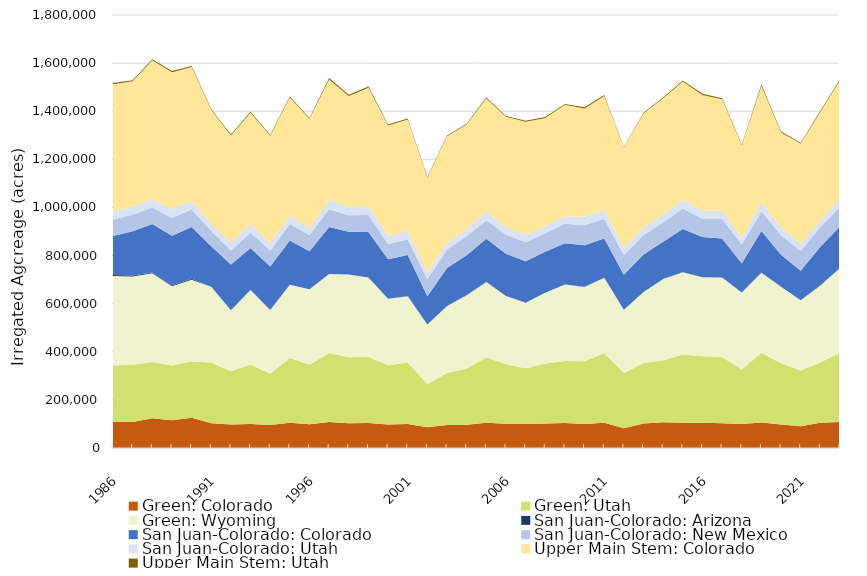
| Category | Green: Colorado | Green: Utah | Green: Wyoming | San Juan-Colorado: Arizona | San Juan-Colorado: Colorado | San Juan-Colorado: New Mexico | San Juan-Colorado: Utah | Upper Main Stem: Colorado | Upper Main Stem: Utah |
|---|---|---|---|---|---|---|---|---|---|
| 1986.0 | 108564.1 | 235099.1 | 371794.9 | 3542.6 | 161922.8 | 68577.935 | 33633.6 | 529498.6 | 4290.4 |
| 1987.0 | 107770.3 | 237896.3 | 367336.9 | 3640.4 | 183883.4 | 69008.867 | 34666.2 | 520237 | 4470.6 |
| 1988.0 | 123202.4 | 234502.7 | 368721.4 | 3605.4 | 200950.7 | 68965.9 | 33185.7 | 578417.6 | 4443.1 |
| 1989.0 | 115198.5 | 227786.3 | 329173.2 | 3615.4 | 206288.1 | 74526.852 | 35849.6 | 569736 | 4615.9 |
| 1990.0 | 125362.4 | 234484.6 | 339600.2 | 3615.4 | 215620.2 | 74213.884 | 33851.4 | 556662.9 | 4619.6 |
| 1991.0 | 102816.089 | 252582.027 | 315249.053 | 60.802 | 167611.681 | 63527.016 | 28973.363 | 475054.107 | 2971.505 |
| 1992.0 | 98001.317 | 220829.404 | 253893.974 | 960.042 | 189081.826 | 58082.038 | 30831.679 | 447688.819 | 3727.644 |
| 1993.0 | 99899.431 | 247557.215 | 309874.845 | 740.572 | 173714.392 | 63581.146 | 34891.268 | 462992.77 | 4849.187 |
| 1994.0 | 95855.856 | 212855.28 | 265392.669 | 443.58 | 179721.995 | 66030.718 | 30922.055 | 446907.934 | 3343.739 |
| 1995.0 | 104803.051 | 269739.684 | 303878.728 | 670.646 | 183443.244 | 68602.664 | 34271.201 | 491149.618 | 4615.3 |
| 1996.0 | 98979.612 | 247104.93 | 313726.681 | 255.992 | 158324.201 | 66661.802 | 27790.065 | 455653.498 | 3417.122 |
| 1997.0 | 108085.373 | 287114.978 | 327897.571 | 602.453 | 195298.019 | 73200.696 | 39514.212 | 500198.913 | 5697.496 |
| 1998.0 | 102461.942 | 274405.074 | 343958.893 | 396.016 | 177546.191 | 68719.799 | 34837.383 | 460998.235 | 4790.471 |
| 1999.0 | 103640.832 | 276206.8 | 328817.883 | 432.022 | 188415.858 | 70960.851 | 37371.301 | 491950.516 | 4919.034 |
| 2000.0 | 97617.477 | 246289.445 | 276050.322 | 263.601 | 163969.261 | 63750.331 | 31945.661 | 460793.985 | 4186.443 |
| 2001.0 | 100278.168 | 255191.714 | 275622.704 | 368.231 | 170340.513 | 66449.017 | 34476.178 | 462670.362 | 4307.909 |
| 2002.0 | 86203.521 | 178638.755 | 248846.934 | 121 | 117483.692 | 69853.916 | 25311.556 | 398520.343 | 2926.071 |
| 2003.0 | 95480.51 | 215855.768 | 278792.462 | 376.684 | 157519.827 | 77289.205 | 26738.539 | 443858.019 | 3435.502 |
| 2004.0 | 97060.702 | 232435.324 | 305918.614 | 176.228 | 166157.488 | 78066.845 | 30189.863 | 434463.958 | 3521.544 |
| 2005.0 | 104468.923 | 273043.838 | 312900.327 | 861.402 | 178151.364 | 76969.052 | 35273.636 | 470716.564 | 4766.38 |
| 2006.0 | 100290.478 | 247921.543 | 283166.291 | 115.576 | 176523.384 | 78222.768 | 31227.582 | 459336.008 | 3634.344 |
| 2007.0 | 100123.904 | 230963.207 | 273152.865 | 707.696 | 171507.252 | 78434.011 | 31353.429 | 470159.47 | 4181.719 |
| 2008.0 | 101864.894 | 249328.206 | 294244.803 | 271.724 | 170545.259 | 76785.776 | 29592.367 | 449453.674 | 3620.413 |
| 2009.0 | 103892.646 | 257623.894 | 318235.098 | 82.731 | 170970.538 | 81149.593 | 30453.878 | 464314.283 | 3570.83 |
| 2010.0 | 99301.723 | 261056.611 | 309031.924 | 448.335 | 173432.392 | 83074.402 | 34968.039 | 449998.588 | 4736.448 |
| 2011.0 | 104850.969 | 289339.576 | 313524.617 | 264.95 | 163174.743 | 82323.416 | 35687.744 | 473961.991 | 4247.061 |
| 2012.0 | 82490.843 | 229560.224 | 262667.957 | 46.221 | 145380.232 | 81107.347 | 28683.158 | 419016.892 | 2518.418 |
| 2013.0 | 102191.321 | 250818.656 | 295105.73 | 423.634 | 156088.864 | 80911.995 | 32049.737 | 472923.066 | 3187.319 |
| 2014.0 | 107064.969 | 258224.344 | 337591.831 | 57.721 | 154827.136 | 79755.47 | 33167.297 | 482806.698 | 3406.989 |
| 2015.0 | 105069.544 | 283462.68 | 341676.827 | 1176.816 | 179044.827 | 85474.726 | 36413.434 | 491165.125 | 3922.517 |
| 2016.0 | 104981.503 | 276280.883 | 328416.56 | 284.121 | 166976.148 | 74592.533 | 34776.866 | 481122.589 | 5487.404 |
| 2017.0 | 102824.009 | 275120.351 | 330645.265 | 371.104 | 161513.356 | 81804.569 | 34135.048 | 463429.381 | 4269.377 |
| 2018.0 | 99295.141 | 227545.578 | 319558.835 | 127.701 | 120541.942 | 78639.058 | 28049.083 | 384952.142 | 2493.57 |
| 2019.0 | 105942.54 | 289734.294 | 332842.043 | 735.961 | 172997.163 | 82031.888 | 37015.15 | 483663.022 | 5748.685 |
| 2020.0 | 97207.632 | 254868.745 | 317965.006 | 99.884 | 133281.163 | 81298.074 | 30837.819 | 396133.169 | 3509.427 |
| 2021.0 | 90844.521 | 231176.076 | 292009.56 | 95.004 | 122764.323 | 82316.006 | 29568.074 | 416840.135 | 3593.303 |
| 2022.0 | 105076.121 | 249948.95 | 320864.42 | 1676.521 | 159158.547 | 81489.571 | 28178.797 | 450177.849 | 3869.629 |
| 2023.0 | 108079.627 | 289392.439 | 350350.018 | 348.194 | 173175.3 | 80021.736 | 35625.649 | 490701.431 | 5196.143 |